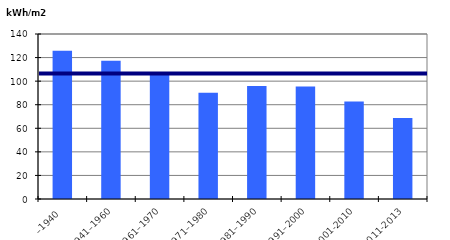
| Category | Byggårskategori |
|---|---|
| –1940 | 125.858 |
| 1941–1960 | 117.401 |
| 1961–1970 | 106.421 |
| 1971–1980 | 90.23 |
| 1981–1990 | 95.972 |
| 1991–2000 | 95.523 |
| 2001-2010 | 82.685 |
| 2011-2013 | 68.77 |